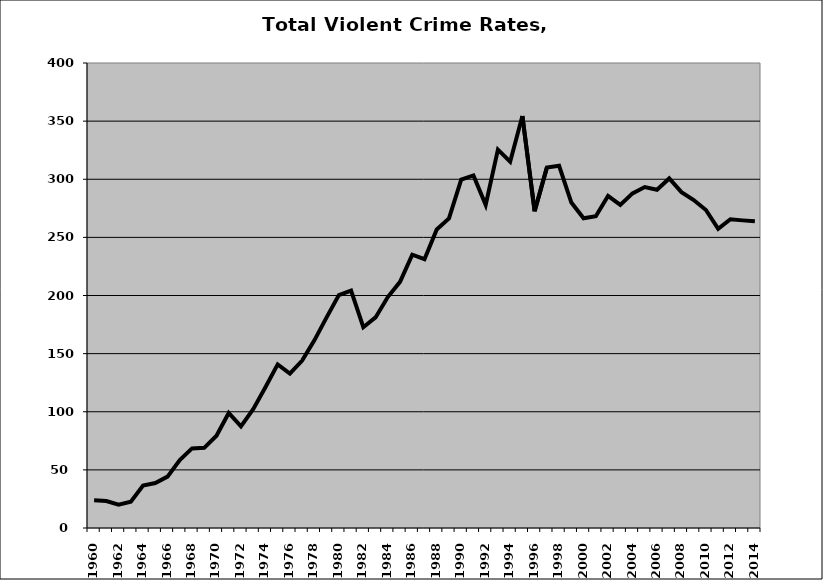
| Category | VCR |
|---|---|
| 1960.0 | 23.789 |
| 1961.0 | 23.138 |
| 1962.0 | 20.13 |
| 1963.0 | 22.626 |
| 1964.0 | 36.538 |
| 1965.0 | 38.659 |
| 1966.0 | 44.194 |
| 1967.0 | 58.409 |
| 1968.0 | 68.486 |
| 1969.0 | 68.968 |
| 1970.0 | 79.326 |
| 1971.0 | 98.948 |
| 1972.0 | 87.374 |
| 1973.0 | 102.273 |
| 1974.0 | 121.016 |
| 1975.0 | 140.732 |
| 1976.0 | 132.857 |
| 1977.0 | 143.974 |
| 1978.0 | 161.395 |
| 1979.0 | 181.157 |
| 1980.0 | 200.357 |
| 1981.0 | 204.177 |
| 1982.0 | 172.737 |
| 1983.0 | 181.136 |
| 1984.0 | 198.66 |
| 1985.0 | 211.72 |
| 1986.0 | 235.11 |
| 1987.0 | 231.228 |
| 1988.0 | 256.845 |
| 1989.0 | 266.303 |
| 1990.0 | 299.666 |
| 1991.0 | 303.292 |
| 1992.0 | 277.952 |
| 1993.0 | 325.48 |
| 1994.0 | 315.094 |
| 1995.0 | 354.363 |
| 1996.0 | 272.475 |
| 1997.0 | 309.993 |
| 1998.0 | 311.53 |
| 1999.0 | 279.988 |
| 2000.0 | 266.409 |
| 2001.0 | 268.25 |
| 2002.0 | 285.71 |
| 2003.0 | 277.874 |
| 2004.0 | 287.818 |
| 2005.0 | 293.27 |
| 2006.0 | 291.004 |
| 2007.0 | 300.698 |
| 2008.0 | 288.946 |
| 2009.0 | 282.095 |
| 2010.0 | 273.54 |
| 2011.0 | 257.27 |
| 2012.0 | 265.59 |
| 2013.0 | 264.622 |
| 2014.0 | 263.813 |